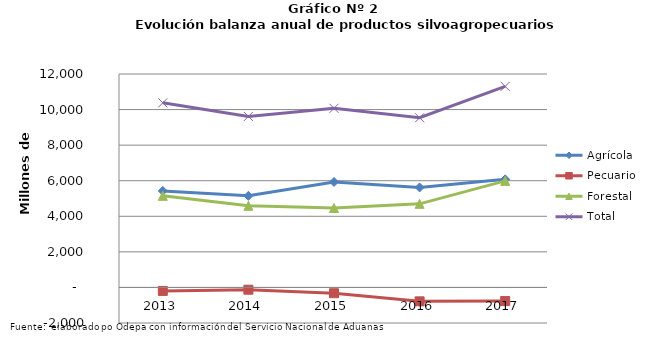
| Category | Agrícola | Pecuario | Forestal | Total |
|---|---|---|---|---|
| 2013.0 | 5424524 | -195643 | 5149868 | 10378749 |
| 2014.0 | 5149872 | -127785 | 4591408 | 9613495 |
| 2015.0 | 5928552 | -325380 | 4468104 | 10071276 |
| 2016.0 | 5622823 | -782588 | 4700192 | 9540427 |
| 2017.0 | 6076796 | -761839 | 5989445 | 11304402 |